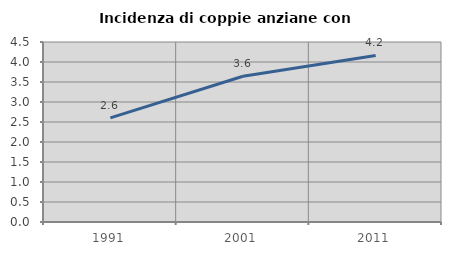
| Category | Incidenza di coppie anziane con figli |
|---|---|
| 1991.0 | 2.604 |
| 2001.0 | 3.644 |
| 2011.0 | 4.164 |